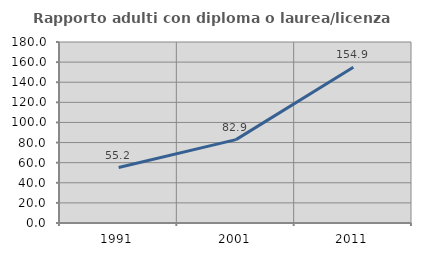
| Category | Rapporto adulti con diploma o laurea/licenza media  |
|---|---|
| 1991.0 | 55.172 |
| 2001.0 | 82.906 |
| 2011.0 | 154.902 |